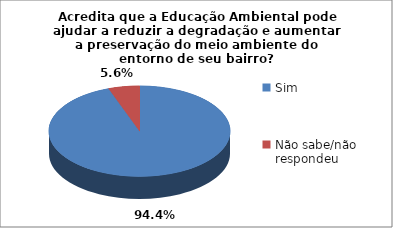
| Category | Series 0 |
|---|---|
| Sim | 34 |
| Não sabe/não respondeu | 2 |